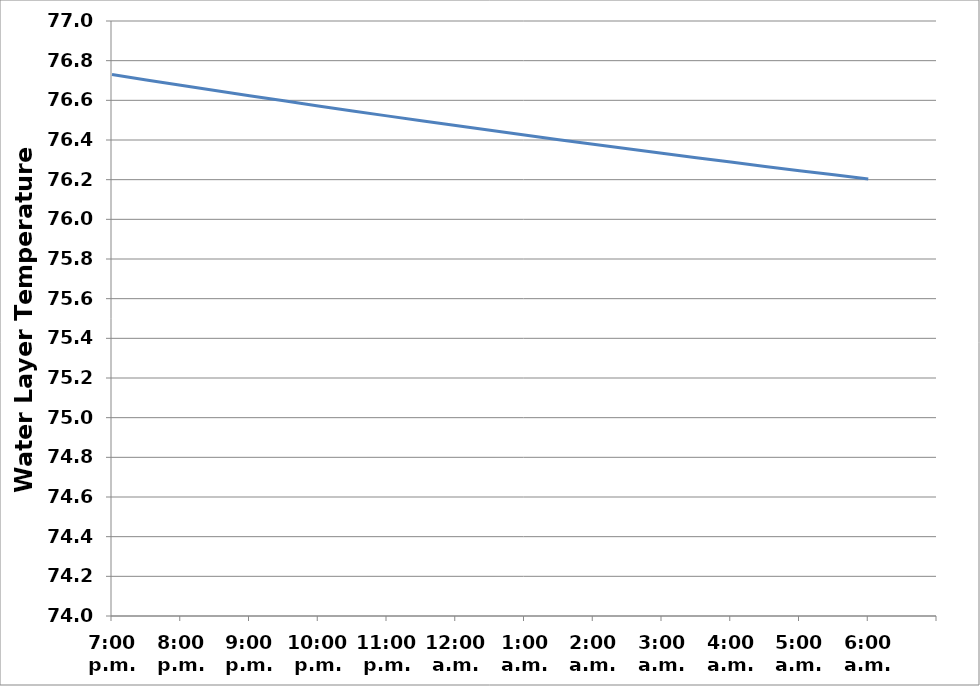
| Category | Series 0 |
|---|---|
| 7:00 p.m. | 76.73 |
| 7:30 p.m. | 76.703 |
| 8:00 p.m. | 76.676 |
| 8:30 p.m. | 76.649 |
| 9:00 p.m. | 76.623 |
| 9:30 p.m. | 76.597 |
| 10:00 p.m. | 76.572 |
| 10:30 p.m. | 76.547 |
| 11:00 p.m. | 76.522 |
| 11:30 p.m. | 76.497 |
| 12:00 a.m. | 76.473 |
| 12:30 a.m. | 76.449 |
| 1:00 a.m. | 76.425 |
| 1:30 a.m. | 76.402 |
| 2:00 a.m. | 76.378 |
| 2:30 a.m. | 76.356 |
| 3:00 a.m. | 76.333 |
| 3:30 a.m. | 76.311 |
| 4:00 a.m. | 76.289 |
| 4:30 a.m. | 76.267 |
| 5:00 a.m. | 76.245 |
| 5:30 a.m. | 76.224 |
| 6:00 a.m. | 76.203 |